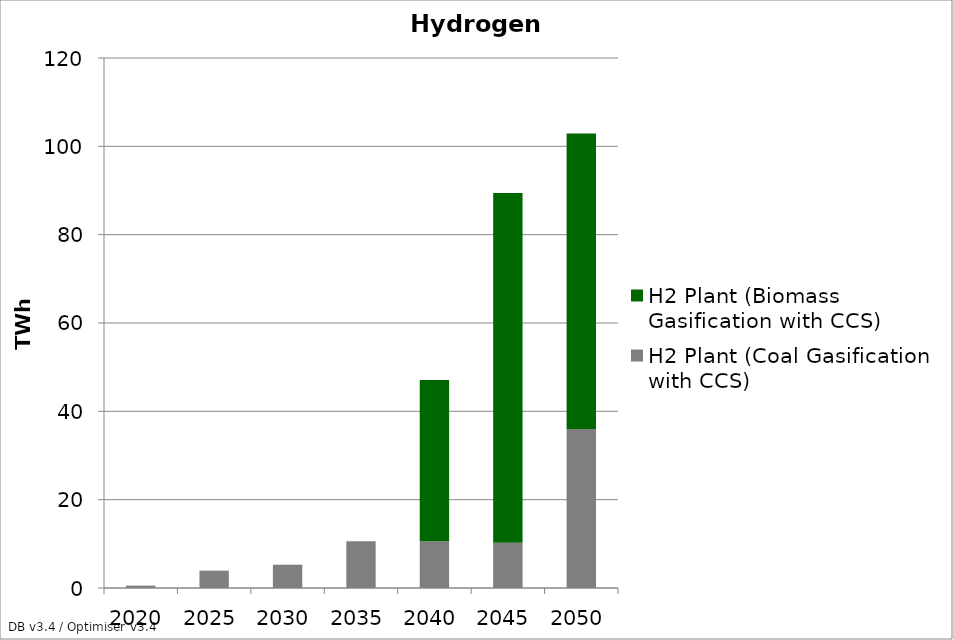
| Category | H2 Plant (Coal Gasification with CCS) | H2 Plant (Biomass Gasification with CCS) |
|---|---|---|
| 2020.0 | 0.55 | 0 |
| 2025.0 | 3.924 | 0 |
| 2030.0 | 5.276 | 0 |
| 2035.0 | 10.599 | 0 |
| 2040.0 | 10.599 | 36.493 |
| 2045.0 | 10.263 | 79.165 |
| 2050.0 | 35.974 | 66.958 |